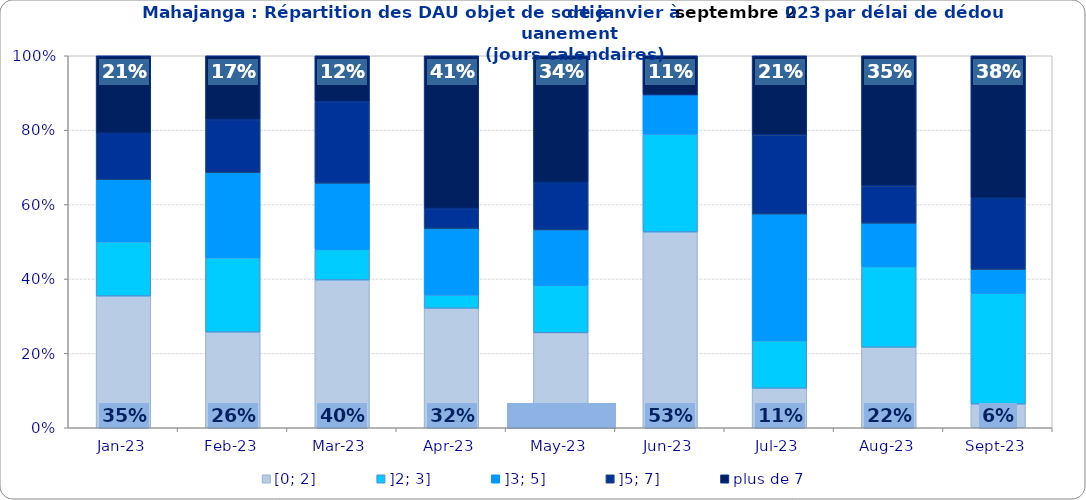
| Category | [0; 2] | ]2; 3] | ]3; 5] | ]5; 7] | plus de 7 |
|---|---|---|---|---|---|
| 2023-01-01 | 0.354 | 0.146 | 0.167 | 0.125 | 0.208 |
| 2023-02-01 | 0.257 | 0.2 | 0.229 | 0.143 | 0.171 |
| 2023-03-01 | 0.397 | 0.082 | 0.178 | 0.219 | 0.123 |
| 2023-04-01 | 0.321 | 0.036 | 0.179 | 0.054 | 0.411 |
| 2023-05-01 | 0.255 | 0.128 | 0.149 | 0.128 | 0.34 |
| 2023-06-01 | 0.526 | 0.263 | 0.105 | 0 | 0.105 |
| 2023-07-01 | 0.106 | 0.128 | 0.34 | 0.213 | 0.213 |
| 2023-08-01 | 0.217 | 0.217 | 0.117 | 0.1 | 0.35 |
| 2023-09-01 | 0.064 | 0.298 | 0.064 | 0.191 | 0.383 |